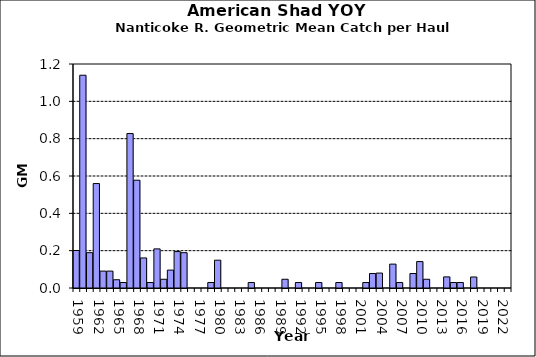
| Category | Series 0 |
|---|---|
| 1959.0 | 0.201 |
| 1960.0 | 1.14 |
| 1961.0 | 0.189 |
| 1962.0 | 0.56 |
| 1963.0 | 0.091 |
| 1964.0 | 0.091 |
| 1965.0 | 0.044 |
| 1966.0 | 0.029 |
| 1967.0 | 0.827 |
| 1968.0 | 0.577 |
| 1969.0 | 0.161 |
| 1970.0 | 0.029 |
| 1971.0 | 0.209 |
| 1972.0 | 0.047 |
| 1973.0 | 0.096 |
| 1974.0 | 0.195 |
| 1975.0 | 0.189 |
| 1976.0 | 0 |
| 1977.0 | 0 |
| 1978.0 | 0 |
| 1979.0 | 0.029 |
| 1980.0 | 0.149 |
| 1981.0 | 0 |
| 1982.0 | 0 |
| 1983.0 | 0 |
| 1984.0 | 0 |
| 1985.0 | 0.029 |
| 1986.0 | 0 |
| 1987.0 | 0 |
| 1988.0 | 0 |
| 1989.0 | 0 |
| 1990.0 | 0.047 |
| 1991.0 | 0 |
| 1992.0 | 0.029 |
| 1993.0 | 0 |
| 1994.0 | 0 |
| 1995.0 | 0.029 |
| 1996.0 | 0 |
| 1997.0 | 0 |
| 1998.0 | 0.029 |
| 1999.0 | 0 |
| 2000.0 | 0 |
| 2001.0 | 0 |
| 2002.0 | 0.029 |
| 2003.0 | 0.078 |
| 2004.0 | 0.08 |
| 2005.0 | 0 |
| 2006.0 | 0.128 |
| 2007.0 | 0.029 |
| 2008.0 | 0 |
| 2009.0 | 0.078 |
| 2010.0 | 0.142 |
| 2011.0 | 0.047 |
| 2012.0 | 0 |
| 2013.0 | 0 |
| 2014.0 | 0.059 |
| 2015.0 | 0.029 |
| 2016.0 | 0.029 |
| 2017.0 | 0 |
| 2018.0 | 0.059 |
| 2019.0 | 0 |
| 2020.0 | 0 |
| 2021.0 | 0 |
| 2022.0 | 0 |
| 2023.0 | 0 |